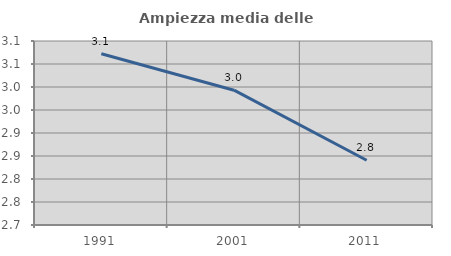
| Category | Ampiezza media delle famiglie |
|---|---|
| 1991.0 | 3.072 |
| 2001.0 | 2.993 |
| 2011.0 | 2.841 |